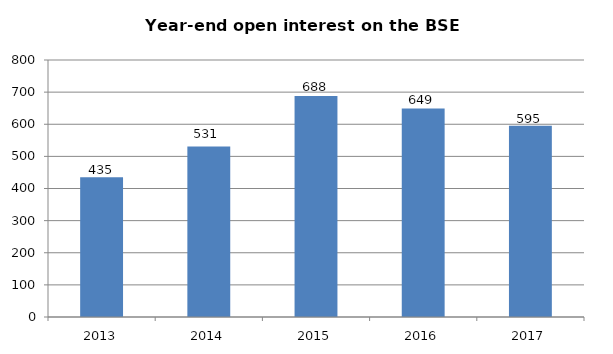
| Category | BSE contracts (thousands) |
|---|---|
| 2013.0 | 435 |
| 2014.0 | 531 |
| 2015.0 | 688.194 |
| 2016.0 | 648.876 |
| 2017.0 | 595 |